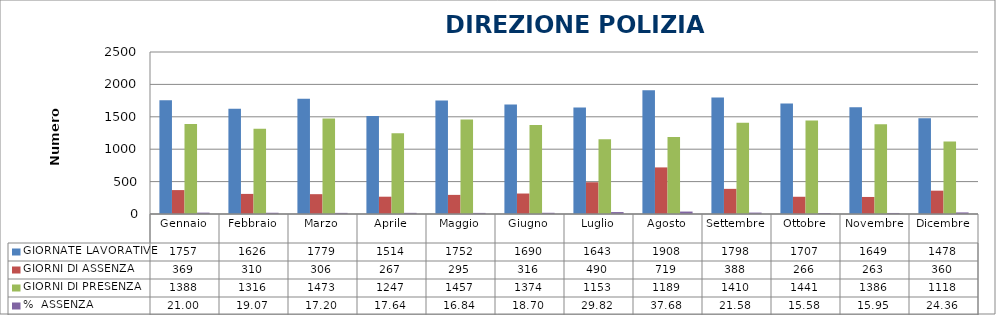
| Category | GIORNATE LAVORATIVE | GIORNI DI ASSENZA | GIORNI DI PRESENZA | %  ASSENZA |
|---|---|---|---|---|
| Gennaio | 1757 | 369 | 1388 | 21.002 |
| Febbraio | 1626 | 310 | 1316 | 19.065 |
| Marzo | 1779 | 306 | 1473 | 17.201 |
| Aprile | 1514 | 267 | 1247 | 17.635 |
| Maggio | 1752 | 295 | 1457 | 16.838 |
| Giugno | 1690 | 316 | 1374 | 18.698 |
| Luglio | 1643 | 490 | 1153 | 29.823 |
| Agosto | 1908 | 719 | 1189 | 37.683 |
| Settembre | 1798 | 388 | 1410 | 21.58 |
| Ottobre | 1707 | 266 | 1441 | 15.583 |
| Novembre | 1649 | 263 | 1386 | 15.949 |
| Dicembre | 1478 | 360 | 1118 | 24.357 |